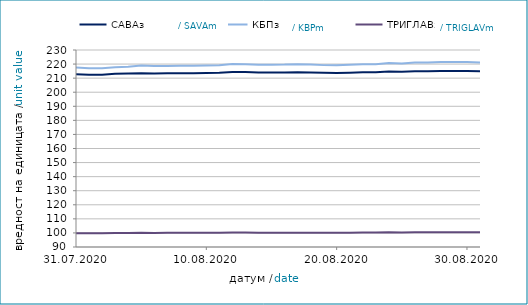
| Category | САВАз | КБПз | ТРИГЛАВз |
|---|---|---|---|
| 2020-07-31 | 212.719 | 217.502 | 99.836 |
| 2020-08-01 | 212.436 | 217.01 | 99.721 |
| 2020-08-02 | 212.448 | 217.022 | 99.725 |
| 2020-08-03 | 213.036 | 217.762 | 99.888 |
| 2020-08-04 | 213.212 | 218.065 | 99.937 |
| 2020-08-05 | 213.539 | 218.901 | 100.077 |
| 2020-08-06 | 213.315 | 218.644 | 99.991 |
| 2020-08-07 | 213.423 | 218.638 | 100.055 |
| 2020-08-08 | 213.501 | 218.777 | 100.088 |
| 2020-08-09 | 213.514 | 218.79 | 100.092 |
| 2020-08-10 | 213.649 | 219.014 | 100.129 |
| 2020-08-11 | 213.883 | 219.204 | 100.153 |
| 2020-08-12 | 214.401 | 220.052 | 100.329 |
| 2020-08-13 | 214.281 | 219.94 | 100.262 |
| 2020-08-14 | 213.957 | 219.493 | 100.132 |
| 2020-08-15 | 214.032 | 219.604 | 100.159 |
| 2020-08-16 | 214.044 | 219.617 | 100.163 |
| 2020-08-17 | 214.214 | 219.943 | 100.212 |
| 2020-08-18 | 214.094 | 219.733 | 100.169 |
| 2020-08-19 | 213.846 | 219.251 | 100.078 |
| 2020-08-20 | 213.68 | 219.099 | 100.062 |
| 2020-08-21 | 213.895 | 219.523 | 100.177 |
| 2020-08-22 | 214.148 | 219.934 | 100.272 |
| 2020-08-23 | 214.16 | 219.946 | 100.276 |
| 2020-08-24 | 214.65 | 220.695 | 100.441 |
| 2020-08-25 | 214.481 | 220.463 | 100.335 |
| 2020-08-26 | 214.939 | 221.121 | 100.487 |
| 2020-08-27 | 214.93 | 221.136 | 100.478 |
| 2020-08-28 | 215.116 | 221.477 | 100.474 |
| 2020-08-29 | 215.129 | 221.489 | 100.478 |
| 2020-08-30 | 215.141 | 221.502 | 100.481 |
| 2020-08-31 | 214.971 | 221.069 | 100.445 |